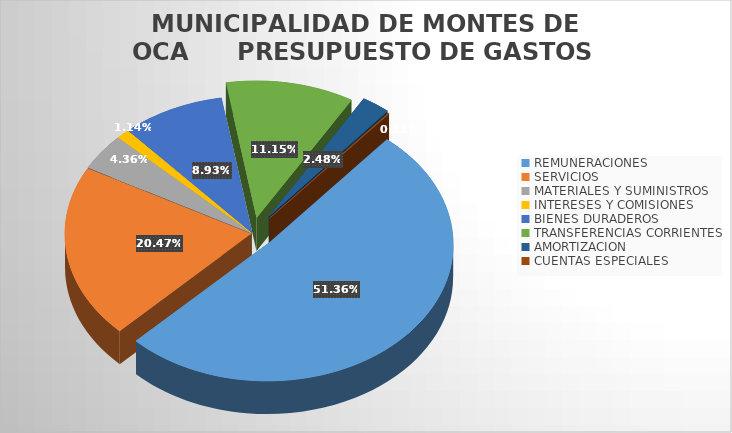
| Category | Series 0 |
|---|---|
| REMUNERACIONES | 3309079561.303 |
| SERVICIOS  | 1318740898.27 |
| MATERIALES Y SUMINISTROS | 280893835.96 |
| INTERESES Y COMISIONES  | 73688245.3 |
| BIENES DURADEROS | 575430796.71 |
| TRANSFERENCIAS CORRIENTES | 718396380.873 |
| AMORTIZACION  | 159970283.35 |
| CUENTAS ESPECIALES | 7000250.31 |